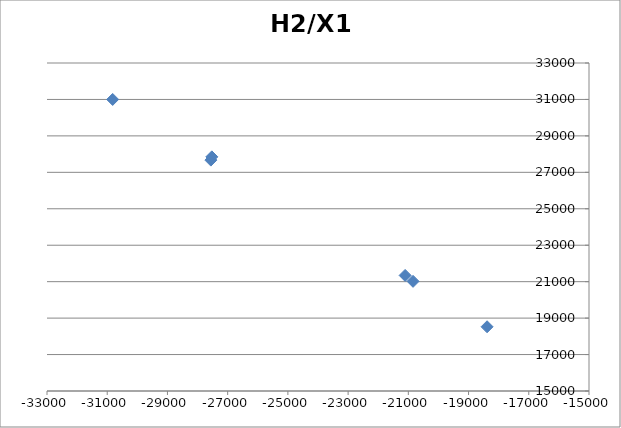
| Category | H2/X1 |
|---|---|
| -27558.0 | 27670.9 |
| -20843.0 | 21018.4 |
| -21106.0 | 21342.5 |
| -27526.0 | 27850 |
| -18385.0 | 18525 |
| -30819.0 | 31000 |